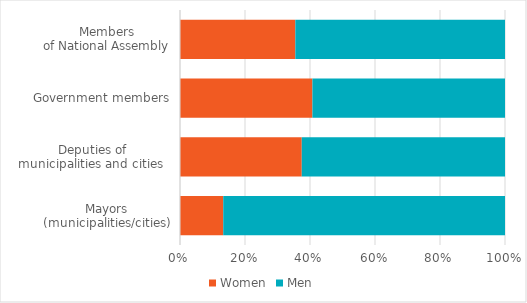
| Category | Women | Men |
|---|---|---|
| Mayors
(municipalities/cities) | 13.3 | 86.67 |
| Deputies of
municipalities and cities 
 | 37.62 | 62.8 |
| Government members | 40.741 | 59.259 |
| Members
of National Assembly | 35.484 | 64.516 |